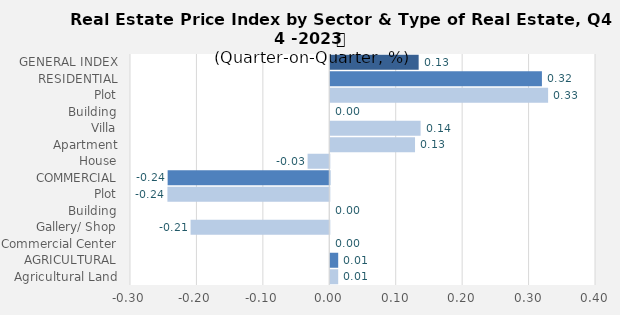
| Category | Q3-2023 |
|---|---|
| GENERAL INDEX | 0.133 |
| RESIDENTIAL | 0.319 |
| Plot | 0.328 |
| Building | 0 |
| Villa | 0.136 |
| Apartment | 0.128 |
| House | -0.033 |
| COMMERCIAL | -0.243 |
| Plot | -0.244 |
| Building | 0 |
| Gallery/ Shop | -0.209 |
| Commercial Center | 0 |
| AGRICULTURAL | 0.012 |
| Agricultural Land | 0.012 |